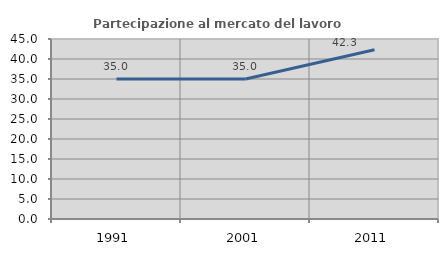
| Category | Partecipazione al mercato del lavoro  femminile |
|---|---|
| 1991.0 | 34.974 |
| 2001.0 | 35.011 |
| 2011.0 | 42.314 |